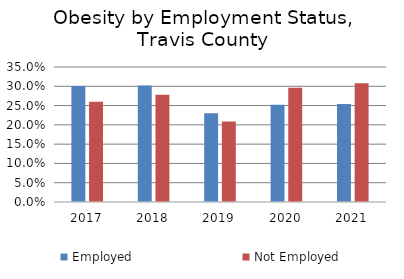
| Category | Employed | Not Employed |
|---|---|---|
| 2017.0 | 0.301 | 0.26 |
| 2018.0 | 0.302 | 0.278 |
| 2019.0 | 0.23 | 0.209 |
| 2020.0 | 0.252 | 0.296 |
| 2021.0 | 0.254 | 0.308 |